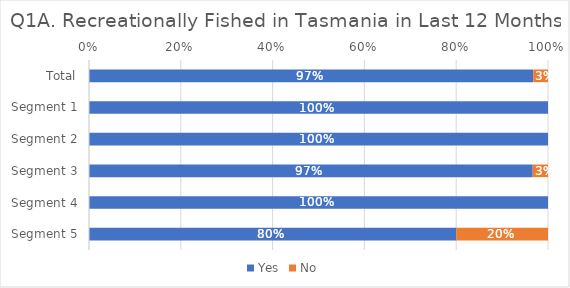
| Category | Yes | No |
|---|---|---|
| Total | 0.968 | 0.032 |
| Segment 1 | 1 | 0 |
| Segment 2 | 1 | 0 |
| Segment 3 | 0.967 | 0.033 |
| Segment 4 | 1 | 0 |
| Segment 5 | 0.8 | 0.2 |